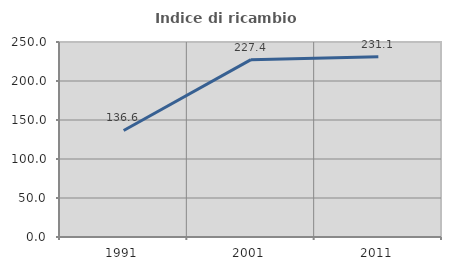
| Category | Indice di ricambio occupazionale  |
|---|---|
| 1991.0 | 136.612 |
| 2001.0 | 227.359 |
| 2011.0 | 231.116 |